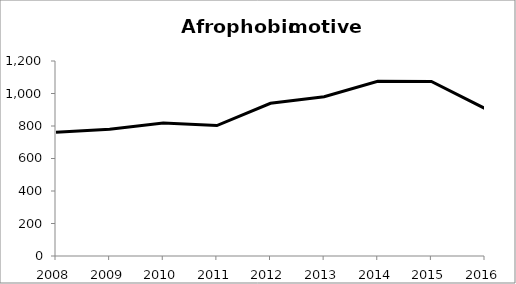
| Category | Series 0 |
|---|---|
| 2008.0 | 761 |
| 2009.0 | 780 |
| 2010.0 | 818 |
| 2011.0 | 803 |
| 2012.0 | 940 |
| 2013.0 | 980 |
| 2014.0 | 1075 |
| 2015.0 | 1074 |
| 2016.0 | 908 |